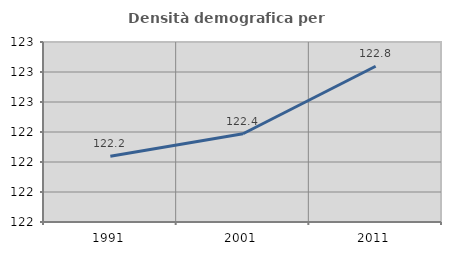
| Category | Densità demografica |
|---|---|
| 1991.0 | 122.238 |
| 2001.0 | 122.388 |
| 2011.0 | 122.838 |